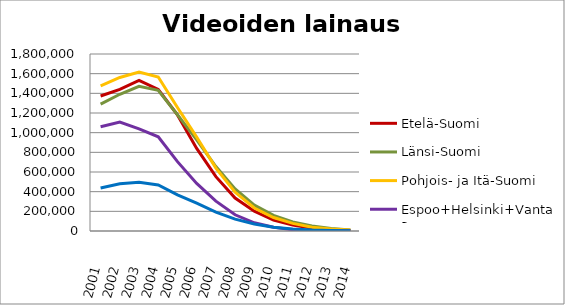
| Category | Etelä-Suomi | Länsi-Suomi | Pohjois- ja Itä-Suomi | Espoo+Helsinki+Vantaa | Muu Uusimaa |
|---|---|---|---|---|---|
| 2001.0 | 1372812 | 1289632 | 1475905 | 1059542 | 436874 |
| 2002.0 | 1440682 | 1390292 | 1561428 | 1108183 | 480102 |
| 2003.0 | 1531358 | 1471192 | 1615543 | 1039074 | 494515 |
| 2004.0 | 1438866 | 1430173 | 1566202 | 957734 | 467420 |
| 2005.0 | 1180739 | 1182201 | 1255355 | 705394 | 368169 |
| 2006.0 | 839354 | 927443 | 954658 | 484002 | 283031 |
| 2007.0 | 552471 | 655586 | 639880 | 303990 | 191887 |
| 2008.0 | 335173 | 428037 | 394320 | 164869 | 120275 |
| 2009.0 | 201273 | 262658 | 233714 | 83407 | 70704 |
| 2010.0 | 111053 | 158909 | 137245 | 39095 | 38448 |
| 2011.0 | 60507 | 92458 | 77650 | 13296 | 20878 |
| 2012.0 | 26609 | 50906 | 38981 | 6039 | 8937 |
| 2013.0 | 13500 | 25300 | 20506 | 3269 | 4313 |
| 2014.0 | 5581 | 11346 | 10396 | 2210 | 2472 |